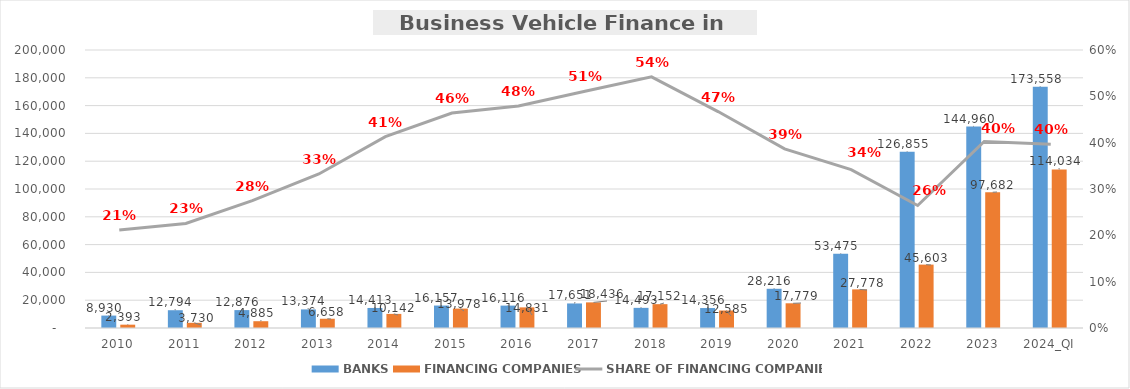
| Category | BANKS | FINANCING COMPANIES |
|---|---|---|
| 2010 | 8930.131 | 2392.721 |
| 2011 | 12793.723 | 3729.987 |
| 2012 | 12876.346 | 4885.495 |
| 2013 | 13374.424 | 6657.806 |
| 2014 | 14412.767 | 10141.887 |
| 2015 | 16157.225 | 13978.426 |
| 2016 | 16116.463 | 14831.249 |
| 2017 | 17650.963 | 18436.034 |
| 2018 | 14492.83 | 17152.034 |
| 2019 | 14355.978 | 12584.792 |
| 2020 | 28216.157 | 17779.072 |
| 2021 | 53475.488 | 27778.353 |
| 2022 | 126855.404 | 45602.871 |
| 2023 | 144959.787 | 97681.588 |
| 2024_QI | 173557.646 | 114033.764 |